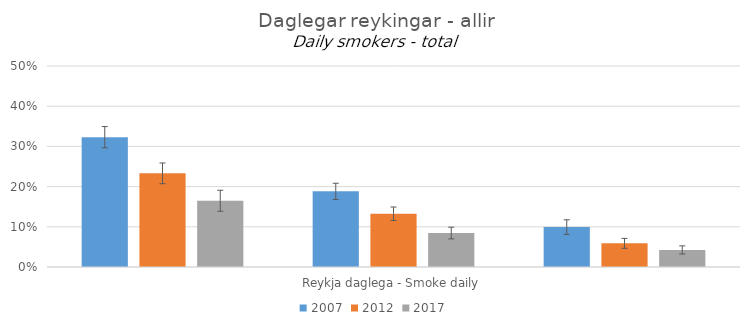
| Category | 2007 | 2012 | 2017 |
|---|---|---|---|
| 0 | 0.323 | 0.233 | 0.165 |
| 1 | 0.188 | 0.132 | 0.084 |
| 2 | 0.099 | 0.059 | 0.043 |